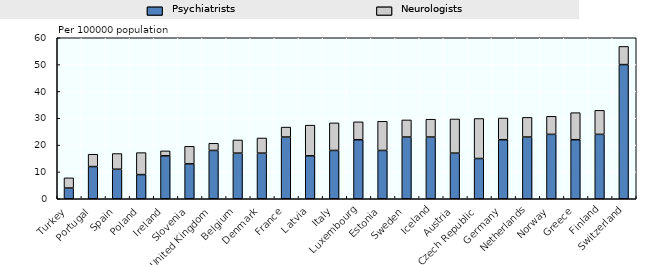
| Category | Psychiatrists | Neurologists |
|---|---|---|
| Turkey | 4 | 3.79 |
| Portugal | 12 | 4.59 |
| Spain | 11 | 5.85 |
| Poland | 9 | 8.2 |
| Ireland | 16 | 1.84 |
| Slovenia | 13 | 6.54 |
| United Kingdom | 18 | 2.67 |
| Belgium | 17 | 4.91 |
| Denmark | 17 | 5.65 |
| France | 23 | 3.71 |
| Latvia | 16 | 11.43 |
| Italy | 18 | 10.28 |
| Luxembourg | 22 | 6.67 |
| Estonia | 18 | 10.87 |
| Sweden | 23 | 6.38 |
| Iceland | 23 | 6.65 |
| Austria | 17 | 12.74 |
| Czech Republic | 15 | 14.91 |
| Germany | 22 | 8.09 |
| Netherlands | 23 | 7.33 |
| Norway | 24 | 6.73 |
| Greece | 22 | 10.09 |
| Finland | 24 | 8.95 |
| Switzerland | 50 | 6.77 |